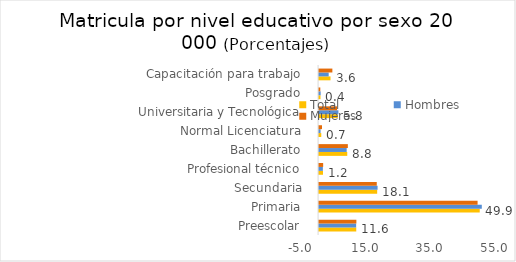
| Category | Total | Hombres | Mujeres |
|---|---|---|---|
| Preescolar  | 11.558 | 11.521 | 11.596 |
| Primaria  | 49.939 | 50.589 | 49.274 |
| Secundaria  | 18.06 | 18.185 | 17.932 |
| Profesional técnico  | 1.221 | 1.174 | 1.268 |
| Bachillerato  | 8.758 | 8.579 | 8.941 |
| Normal Licenciatura  | 0.678 | 0.462 | 0.9 |
| Universitaria y Tecnológica  | 5.8 | 6.014 | 5.581 |
| Posgrado  | 0.435 | 0.492 | 0.377 |
| Capacitación para trabajo  | 3.551 | 2.983 | 4.13 |